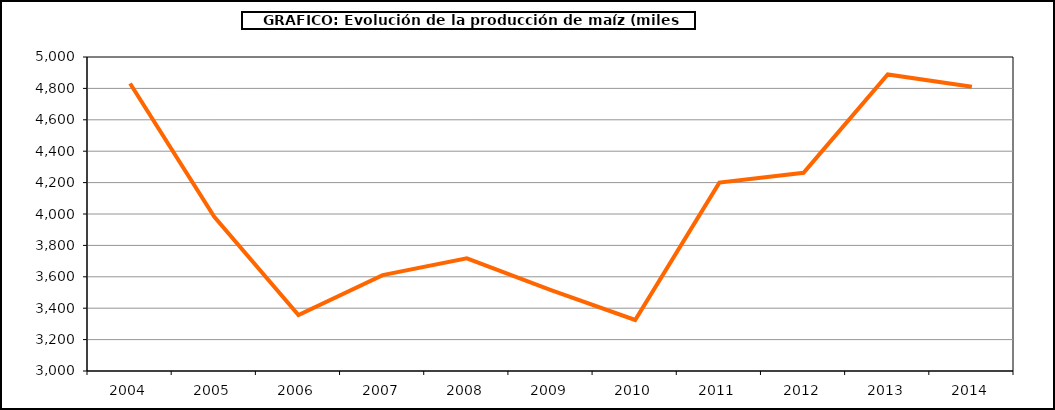
| Category | Superficie |
|---|---|
| 2004.0 | 4831.147 |
| 2005.0 | 3981.37 |
| 2006.0 | 3355.722 |
| 2007.0 | 3610.937 |
| 2008.0 | 3717.671 |
| 2009.0 | 3515.617 |
| 2010.0 | 3324.821 |
| 2011.0 | 4199.927 |
| 2012.0 | 4262.116 |
| 2013.0 | 4888.462 |
| 2014.0 | 4810.645 |